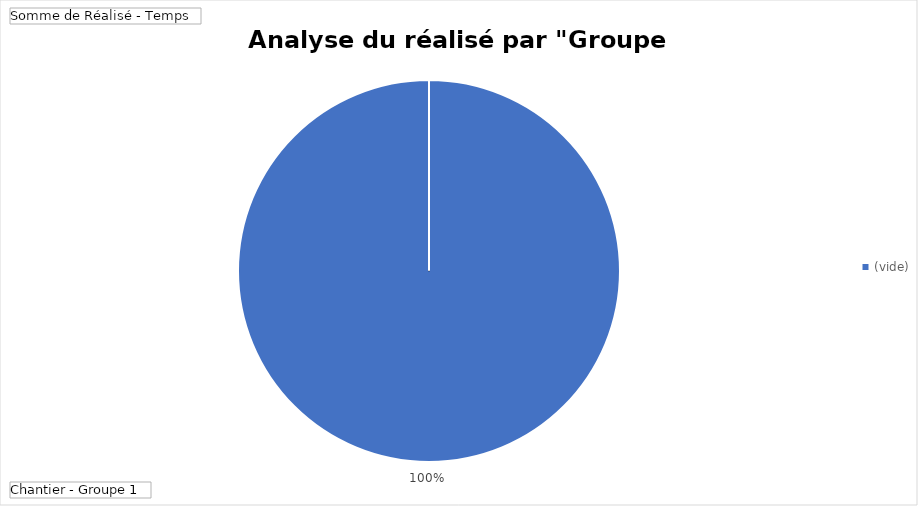
| Category | Total |
|---|---|
| (vide) | 11535.5 |